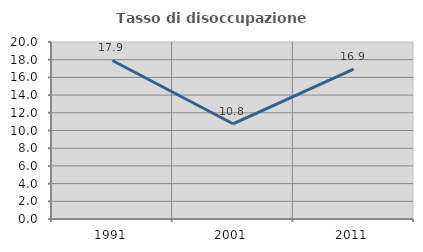
| Category | Tasso di disoccupazione giovanile  |
|---|---|
| 1991.0 | 17.913 |
| 2001.0 | 10.759 |
| 2011.0 | 16.928 |